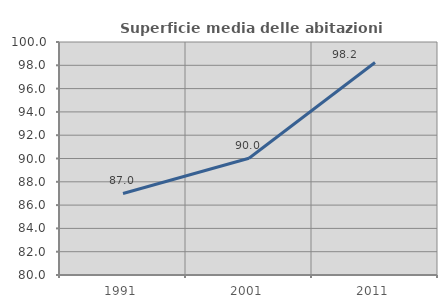
| Category | Superficie media delle abitazioni occupate |
|---|---|
| 1991.0 | 86.996 |
| 2001.0 | 90.022 |
| 2011.0 | 98.243 |